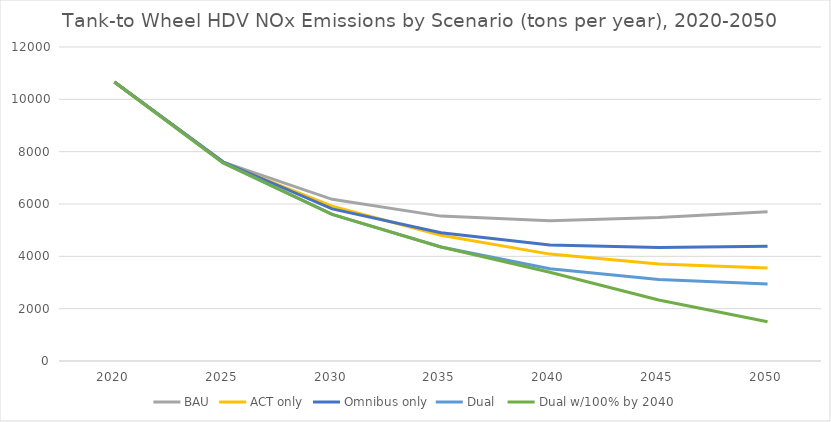
| Category | BAU | ACT only | Omnibus only | Dual  | Dual w/100% by 2040 |
|---|---|---|---|---|---|
| 2020.0 | 10662.42 | 10662.42 | 10662.42 | 10662.42 | 10662.42 |
| 2025.0 | 7602.829 | 7572.646 | 7602.829 | 7572.646 | 7572.646 |
| 2030.0 | 6179.696 | 5915.348 | 5813.086 | 5600.325 | 5600.325 |
| 2035.0 | 5536.99 | 4808.982 | 4899.748 | 4356.821 | 4356.821 |
| 2040.0 | 5360.744 | 4084.802 | 4430.766 | 3528.706 | 3393.159 |
| 2045.0 | 5484.777 | 3709.592 | 4337.466 | 3117.947 | 2330.685 |
| 2050.0 | 5706.792 | 3555.345 | 4387.818 | 2938.612 | 1503.314 |